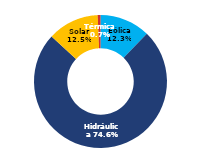
| Category | Sur |
|---|---|
| Eólica | 72.263 |
| Hidráulica | 439.351 |
| Solar | 73.65 |
| Térmica | 3.89 |